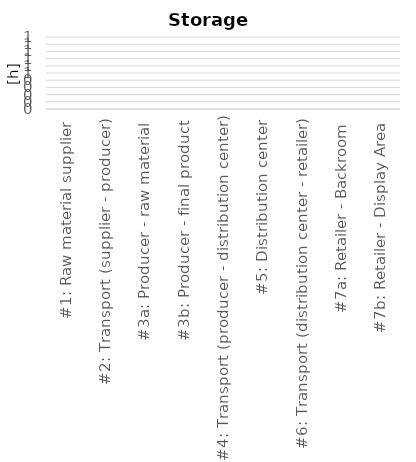
| Category | Series 3 |
|---|---|
| #1: Raw material supplier | 0 |
| #2: Transport (supplier - producer) | 0 |
| #3a: Producer - raw material | 0 |
| #3b: Producer - final product | 0 |
| #4: Transport (producer - distribution center) | 0 |
| #5: Distribution center | 0 |
| #6: Transport (distribution center - retailer) | 0 |
| #7a: Retailer - Backroom | 0 |
| #7b: Retailer - Display Area | 0 |